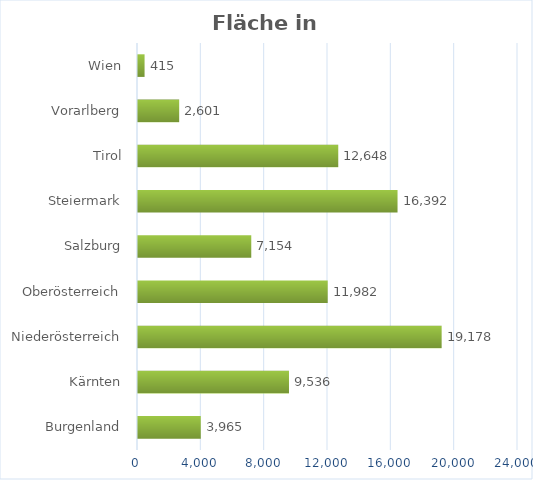
| Category | km² |
|---|---|
| Burgenland | 3965 |
| Kärnten | 9536 |
| Niederösterreich | 19178 |
| Oberösterreich | 11982 |
| Salzburg | 7154 |
| Steiermark | 16392 |
| Tirol | 12648 |
| Vorarlberg | 2601 |
| Wien | 415 |